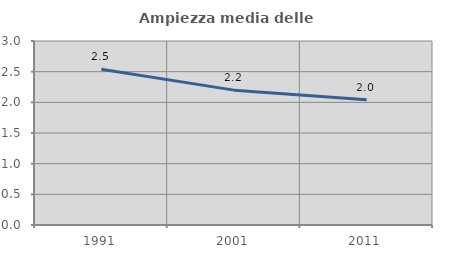
| Category | Ampiezza media delle famiglie |
|---|---|
| 1991.0 | 2.539 |
| 2001.0 | 2.199 |
| 2011.0 | 2.041 |